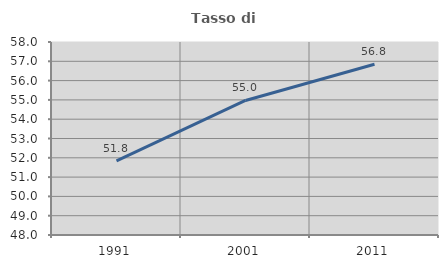
| Category | Tasso di occupazione   |
|---|---|
| 1991.0 | 51.843 |
| 2001.0 | 54.972 |
| 2011.0 | 56.845 |